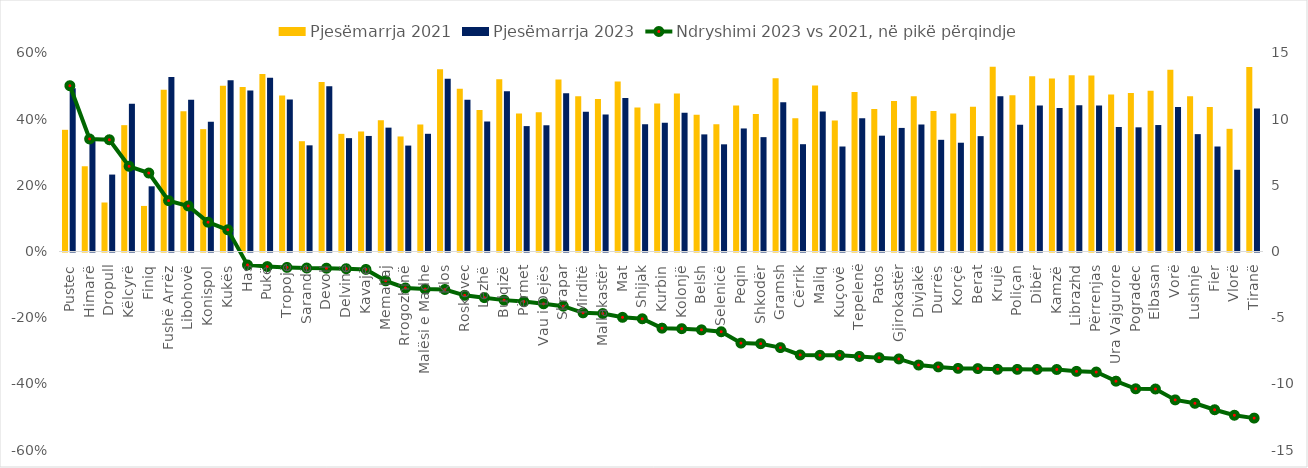
| Category | Pjesëmarrja 2021 | Pjesëmarrja 2023 |
|---|---|---|
| Pustec | 0.368 | 0.493 |
| Himarë | 0.258 | 0.343 |
| Dropull | 0.148 | 0.233 |
| Këlcyrë | 0.382 | 0.446 |
| Finiq | 0.138 | 0.197 |
| Fushë Arrëz | 0.489 | 0.528 |
| Libohovë | 0.424 | 0.458 |
| Konispol | 0.37 | 0.392 |
| Kukës | 0.501 | 0.518 |
| Has | 0.497 | 0.487 |
| Pukë | 0.537 | 0.525 |
| Tropojë | 0.471 | 0.459 |
| Sarandë | 0.333 | 0.321 |
| Devoll | 0.512 | 0.5 |
| Delvinë | 0.356 | 0.343 |
| Kavajë | 0.363 | 0.349 |
| Memaliaj | 0.397 | 0.374 |
| Rrogozhinë | 0.348 | 0.32 |
| Malësi e Madhe | 0.384 | 0.356 |
| Klos | 0.551 | 0.522 |
| Roskovec | 0.492 | 0.459 |
| Lezhë | 0.428 | 0.393 |
| Bulqizë | 0.521 | 0.484 |
| Përmet | 0.417 | 0.379 |
| Vau i Dejës | 0.421 | 0.382 |
| Skrapar | 0.52 | 0.479 |
| Mirditë | 0.469 | 0.423 |
| Mallakastër | 0.461 | 0.414 |
| Mat | 0.514 | 0.464 |
| Shijak | 0.435 | 0.384 |
| Kurbin | 0.447 | 0.389 |
| Kolonjë | 0.478 | 0.42 |
| Belsh | 0.413 | 0.354 |
| Selenicë | 0.385 | 0.324 |
| Peqin | 0.441 | 0.372 |
| Shkodër | 0.415 | 0.346 |
| Gramsh | 0.524 | 0.451 |
| Cërrik | 0.403 | 0.324 |
| Maliq | 0.502 | 0.423 |
| Kuçovë | 0.396 | 0.317 |
| Tepelenë | 0.482 | 0.403 |
| Patos | 0.43 | 0.35 |
| Gjirokastër | 0.455 | 0.374 |
| Divjakë | 0.469 | 0.384 |
| Durrës | 0.425 | 0.338 |
| Korçë | 0.417 | 0.329 |
| Berat | 0.437 | 0.349 |
| Krujë | 0.558 | 0.469 |
| Poliçan | 0.472 | 0.383 |
| Dibër | 0.53 | 0.441 |
| Kamzë | 0.523 | 0.433 |
| Librazhd | 0.532 | 0.442 |
| Përrenjas | 0.532 | 0.441 |
| Ura Vajgurore | 0.474 | 0.376 |
| Pogradec | 0.479 | 0.375 |
| Elbasan | 0.486 | 0.382 |
| Vorë | 0.549 | 0.437 |
| Lushnje | 0.469 | 0.355 |
| Fier | 0.437 | 0.317 |
| Vlorë | 0.371 | 0.247 |
| Tiranë | 0.558 | 0.432 |